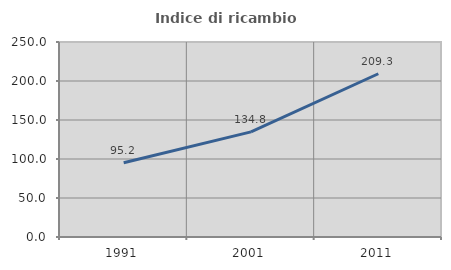
| Category | Indice di ricambio occupazionale  |
|---|---|
| 1991.0 | 95.187 |
| 2001.0 | 134.752 |
| 2011.0 | 209.302 |